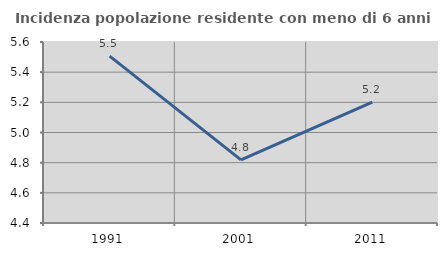
| Category | Incidenza popolazione residente con meno di 6 anni |
|---|---|
| 1991.0 | 5.507 |
| 2001.0 | 4.819 |
| 2011.0 | 5.201 |